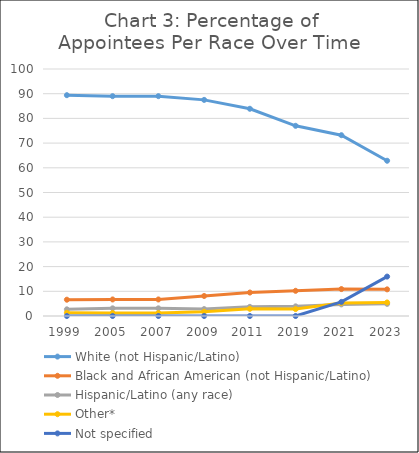
| Category | White (not Hispanic/Latino) | Black and African American (not Hispanic/Latino) | Hispanic/Latino (any race) | Other* | Not specified |
|---|---|---|---|---|---|
| 1999.0 | 89.4 | 6.6 | 2.7 | 1.3 | 0 |
| 2005.0 | 89 | 6.7 | 3.1 | 1.2 | 0 |
| 2007.0 | 89 | 6.7 | 3.1 | 1.2 | 0 |
| 2009.0 | 87.5 | 8.1 | 2.8 | 1.7 | 0 |
| 2011.0 | 83.9 | 9.5 | 3.7 | 2.9 | 0 |
| 2019.0 | 77 | 10.2 | 3.9 | 2.8 | 0 |
| 2021.0 | 73.2 | 10.9 | 4.7 | 5.3 | 5.7 |
| 2023.0 | 62.855 | 10.788 | 4.91 | 5.491 | 15.956 |